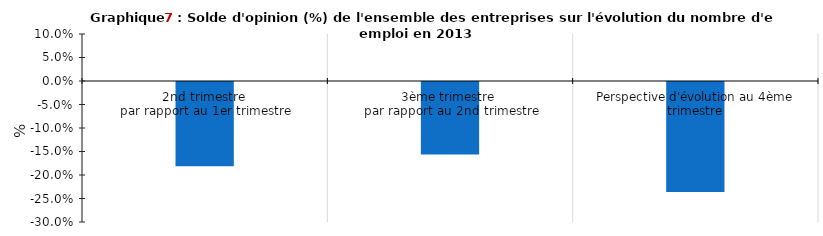
| Category |       Solde d'opinion (%) |
|---|---|
| 2nd trimestre 
par rapport au 1er trimestre | -0.179 |
| 3ème trimestre 
par rapport au 2nd trimestre | -0.154 |
| Perspective d'évolution au 4ème trimestre | -0.234 |